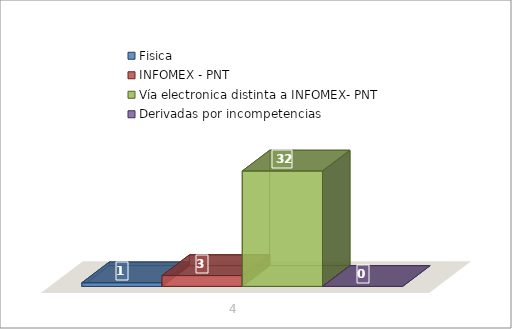
| Category | Fisica | INFOMEX - PNT | Vía electronica distinta a INFOMEX- PNT | Derivadas por incompetencias |
|---|---|---|---|---|
| 0 | 1 | 3 | 32 | 0 |